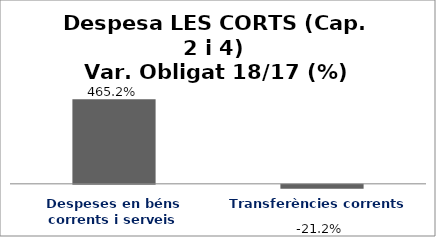
| Category | Series 0 |
|---|---|
| Despeses en béns corrents i serveis | 4.652 |
| Transferències corrents | -0.212 |